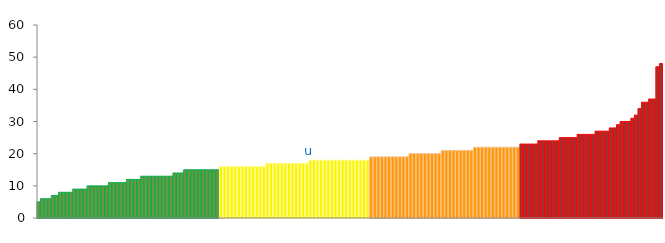
| Category | Top Quartile | 2nd Quartile | 3rd Quartile | Bottom Quartile | Series 4 |
|---|---|---|---|---|---|
|  | 5 | 0 | 0 | 0 | 5 |
|  | 6 | 0 | 0 | 0 | 6 |
|  | 6 | 0 | 0 | 0 | 6 |
|  | 6 | 0 | 0 | 0 | 6 |
|  | 7 | 0 | 0 | 0 | 7 |
|  | 7 | 0 | 0 | 0 | 7 |
|  | 8 | 0 | 0 | 0 | 8 |
|  | 8 | 0 | 0 | 0 | 8 |
|  | 8 | 0 | 0 | 0 | 8 |
|  | 8 | 0 | 0 | 0 | 8 |
|  | 9 | 0 | 0 | 0 | 9 |
|  | 9 | 0 | 0 | 0 | 9 |
|  | 9 | 0 | 0 | 0 | 9 |
|  | 9 | 0 | 0 | 0 | 9 |
|  | 10 | 0 | 0 | 0 | 10 |
|  | 10 | 0 | 0 | 0 | 10 |
|  | 10 | 0 | 0 | 0 | 10 |
|  | 10 | 0 | 0 | 0 | 10 |
|  | 10 | 0 | 0 | 0 | 10 |
|  | 10 | 0 | 0 | 0 | 10 |
|  | 11 | 0 | 0 | 0 | 11 |
|  | 11 | 0 | 0 | 0 | 11 |
|  | 11 | 0 | 0 | 0 | 11 |
|  | 11 | 0 | 0 | 0 | 11 |
|  | 11 | 0 | 0 | 0 | 11 |
|  | 12 | 0 | 0 | 0 | 12 |
|  | 12 | 0 | 0 | 0 | 12 |
|  | 12 | 0 | 0 | 0 | 12 |
|  | 12 | 0 | 0 | 0 | 12 |
|  | 13 | 0 | 0 | 0 | 13 |
|  | 13 | 0 | 0 | 0 | 13 |
|  | 13 | 0 | 0 | 0 | 13 |
|  | 13 | 0 | 0 | 0 | 13 |
|  | 13 | 0 | 0 | 0 | 13 |
|  | 13 | 0 | 0 | 0 | 13 |
|  | 13 | 0 | 0 | 0 | 13 |
|  | 13 | 0 | 0 | 0 | 13 |
|  | 13 | 0 | 0 | 0 | 13 |
|  | 14 | 0 | 0 | 0 | 14 |
|  | 14 | 0 | 0 | 0 | 14 |
|  | 14 | 0 | 0 | 0 | 14 |
|  | 15 | 0 | 0 | 0 | 15 |
|  | 15 | 0 | 0 | 0 | 15 |
|  | 15 | 0 | 0 | 0 | 15 |
|  | 15 | 0 | 0 | 0 | 15 |
|  | 15 | 0 | 0 | 0 | 15 |
|  | 15 | 0 | 0 | 0 | 15 |
|  | 15 | 0 | 0 | 0 | 15 |
|  | 15 | 0 | 0 | 0 | 15 |
|  | 15 | 0 | 0 | 0 | 15 |
|  | 15 | 0 | 0 | 0 | 15 |
|  | 0 | 16 | 0 | 0 | 16 |
|  | 0 | 16 | 0 | 0 | 16 |
|  | 0 | 16 | 0 | 0 | 16 |
|  | 0 | 16 | 0 | 0 | 16 |
|  | 0 | 16 | 0 | 0 | 16 |
|  | 0 | 16 | 0 | 0 | 16 |
|  | 0 | 16 | 0 | 0 | 16 |
|  | 0 | 16 | 0 | 0 | 16 |
|  | 0 | 16 | 0 | 0 | 16 |
|  | 0 | 16 | 0 | 0 | 16 |
|  | 0 | 16 | 0 | 0 | 16 |
|  | 0 | 16 | 0 | 0 | 16 |
|  | 0 | 16 | 0 | 0 | 16 |
|  | 0 | 17 | 0 | 0 | 17 |
|  | 0 | 17 | 0 | 0 | 17 |
|  | 0 | 17 | 0 | 0 | 17 |
|  | 0 | 17 | 0 | 0 | 17 |
|  | 0 | 17 | 0 | 0 | 17 |
|  | 0 | 17 | 0 | 0 | 17 |
|  | 0 | 17 | 0 | 0 | 17 |
|  | 0 | 17 | 0 | 0 | 17 |
|  | 0 | 17 | 0 | 0 | 17 |
|  | 0 | 17 | 0 | 0 | 17 |
|  | 0 | 17 | 0 | 0 | 17 |
|  | 0 | 17 | 0 | 0 | 17 |
| u | 0 | 18 | 0 | 0 | 18 |